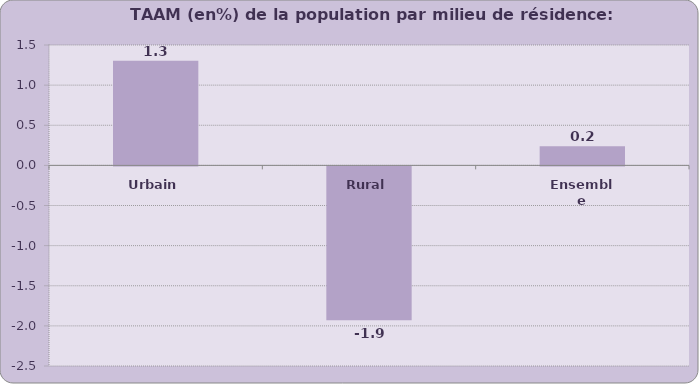
| Category | 2014-2030 |
|---|---|
| Urbain | 1.303 |
| Rural | -1.917 |
| Ensemble | 0.238 |